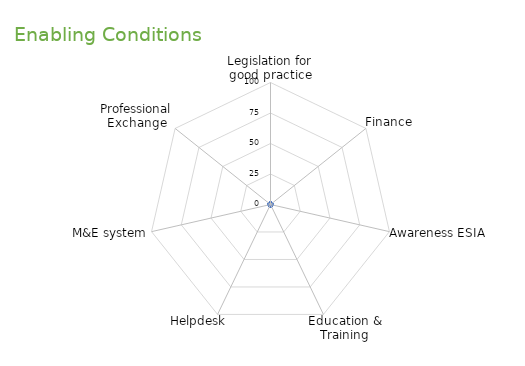
| Category | Series 0 |
|---|---|
| Legislation for good practice | 0 |
| Finance | 0 |
| Awareness ESIA | 0 |
| Education & Training | 0 |
| Helpdesk | 0 |
| M&E system | 0 |
| Professional Exchange | 0 |